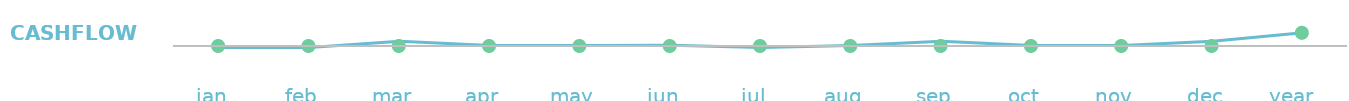
| Category | Cash Flow |
|---|---|
| jan  | -345 |
| feb  | -345 |
| mar  | 1105 |
| apr  | 105 |
| may  | 105 |
| jun  | 195 |
| jul  | -345 |
| aug  | 105 |
| sep  | 1105 |
| oct  | 105 |
| nov  | 105 |
| dec  | 1105 |
| year   | 3000 |